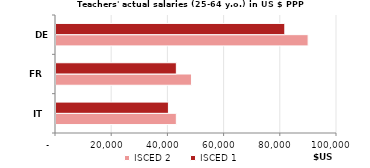
| Category | ISCED 2 | ISCED 1 |
|---|---|---|
| IT | 42822.44 | 40007.993 |
| FR | 48209.354 | 42832.429 |
| DE | 89721.573 | 81428.723 |